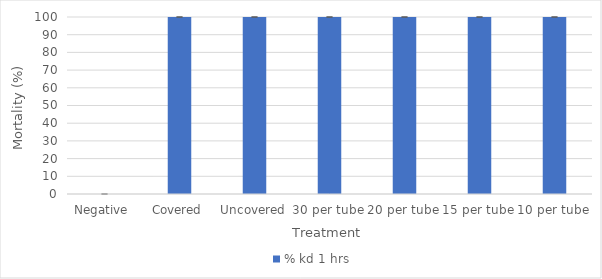
| Category | % kd 1 hrs |
|---|---|
| Negative  | 0 |
| Covered | 100 |
| Uncovered | 100 |
| 30 per tube | 100 |
| 20 per tube | 100 |
| 15 per tube | 100 |
| 10 per tube | 100 |